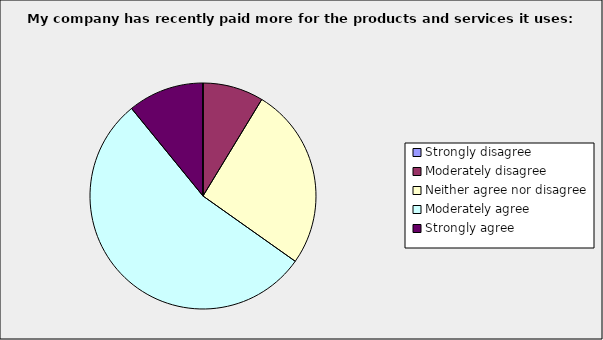
| Category | Series 0 |
|---|---|
| Strongly disagree | 0 |
| Moderately disagree | 0.087 |
| Neither agree nor disagree | 0.261 |
| Moderately agree | 0.543 |
| Strongly agree | 0.109 |